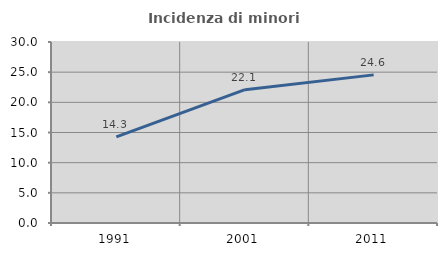
| Category | Incidenza di minori stranieri |
|---|---|
| 1991.0 | 14.286 |
| 2001.0 | 22.093 |
| 2011.0 | 24.551 |